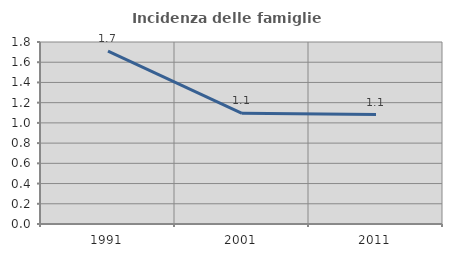
| Category | Incidenza delle famiglie numerose |
|---|---|
| 1991.0 | 1.709 |
| 2001.0 | 1.094 |
| 2011.0 | 1.083 |